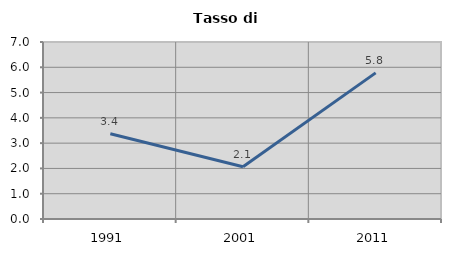
| Category | Tasso di disoccupazione   |
|---|---|
| 1991.0 | 3.371 |
| 2001.0 | 2.065 |
| 2011.0 | 5.778 |